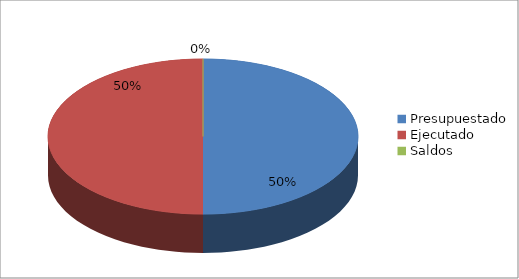
| Category | Series 0 |
|---|---|
| Presupuestado | 3014335000 |
| Ejecutado | 3014335000 |
| Saldos | 0 |